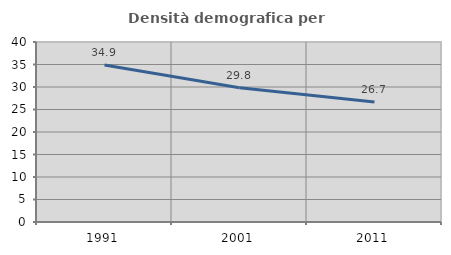
| Category | Densità demografica |
|---|---|
| 1991.0 | 34.906 |
| 2001.0 | 29.823 |
| 2011.0 | 26.684 |